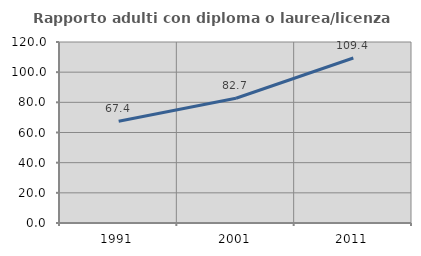
| Category | Rapporto adulti con diploma o laurea/licenza media  |
|---|---|
| 1991.0 | 67.442 |
| 2001.0 | 82.712 |
| 2011.0 | 109.408 |